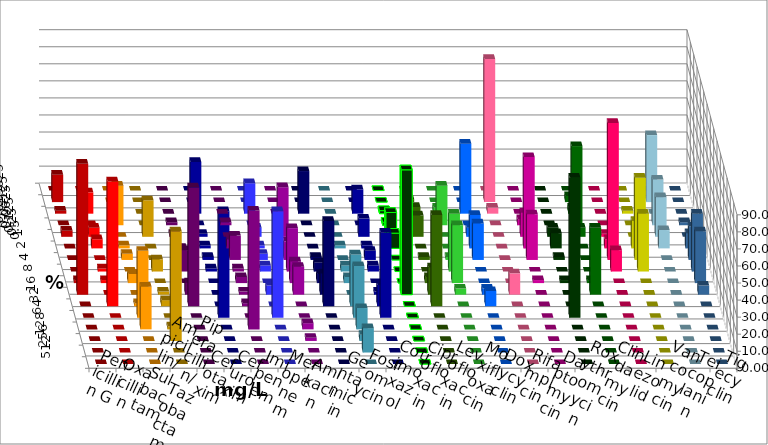
| Category | Penicillin G | Oxacillin | Ampicillin/ Sulbactam | Piperacillin/ Tazobactam | Cefotaxim | Cefuroxim | Imipenem | Meropenem | Amikacin | Gentamicin | Fosfomycin | Cotrimoxazol | Ciprofloxacin | Levofloxacin | Moxifloxacin | Doxycyclin | Rifampicin | Daptomycin | Roxythromycin | Clindamycin | Linezolid | Vancomycin | Teicoplanin | Tigecyclin |
|---|---|---|---|---|---|---|---|---|---|---|---|---|---|---|---|---|---|---|---|---|---|---|---|---|
| 0.015625 | 0 | 0 | 0 | 0 | 0 | 0 | 0 | 0 | 0 | 0 | 0 | 0 | 0 | 0 | 0 | 0 | 0 | 0 | 0 | 0 | 0 | 0 | 0 | 0 |
| 0.03125 | 16.071 | 0 | 0 | 0 | 0 | 0 | 0 | 0 | 0 | 0 | 0 | 0 | 0 | 1.786 | 0 | 0 | 83.929 | 0 | 0 | 3.571 | 0 | 0 | 0 | 39.286 |
| 0.0625 | 1.786 | 12.5 | 0 | 0 | 0 | 0 | 30.357 | 17.857 | 0 | 25 | 0 | 14.286 | 1.786 | 0 | 3.571 | 41.071 | 3.571 | 0 | 0 | 3.571 | 0 | 1.786 | 0 | 0 |
| 0.125 | 0 | 0 | 23.214 | 0 | 1.786 | 1.786 | 0 | 0 | 0 | 0 | 0 | 0 | 1.786 | 10.714 | 23.214 | 0 | 0 | 3.571 | 0 | 46.429 | 0 | 0 | 1.786 | 26.786 |
| 0.25 | 3.571 | 5.357 | 0 | 21.429 | 1.786 | 0 | 1.786 | 5.357 | 29.091 | 0 | 0 | 10.714 | 14.286 | 12.5 | 0 | 5.357 | 0 | 14.286 | 5.357 | 5.357 | 1.786 | 0 | 0 | 23.214 |
| 0.5 | 0 | 5.357 | 1.786 | 0 | 0 | 5.357 | 1.786 | 1.786 | 0 | 0 | 1.786 | 1.786 | 8.929 | 0 | 0 | 19.643 | 0 | 53.571 | 8.929 | 0 | 5.357 | 16.071 | 8.929 | 10.714 |
| 1.0 | 0 | 0 | 3.571 | 0 | 7.143 | 14.286 | 1.786 | 3.571 | 10.909 | 1.786 | 0 | 5.357 | 0 | 1.786 | 1.786 | 21.429 | 0 | 26.786 | 1.786 | 0 | 80.357 | 48.214 | 19.643 | 0 |
| 2.0 | 0 | 1.786 | 0 | 7.143 | 12.5 | 1.786 | 1.786 | 3.571 | 25.455 | 5.357 | 3.571 | 3.571 | 0 | 0 | 33.929 | 0 | 0 | 0 | 0 | 0 | 12.5 | 33.929 | 33.929 | 0 |
| 4.0 | 1.786 | 1.786 | 5.357 | 0 | 0 | 3.571 | 0 | 0 | 12.727 | 5.357 | 3.571 | 0 | 0 | 3.571 | 33.929 | 0 | 0 | 1.786 | 1.786 | 1.786 | 0 | 0 | 30.357 | 0 |
| 8.0 | 76.786 | 0 | 0 | 1.786 | 7.143 | 1.786 | 0 | 5.357 | 16.364 | 12.5 | 0 | 1.786 | 73.214 | 16.071 | 3.571 | 3.571 | 12.5 | 0 | 0 | 39.286 | 0 | 0 | 5.357 | 0 |
| 16.0 | 0 | 73.214 | 1.786 | 3.571 | 69.643 | 1.786 | 0 | 0 | 0 | 50 | 30.357 | 12.5 | 0 | 53.571 | 0 | 8.929 | 0 | 0 | 0 | 0 | 0 | 0 | 0 | 0 |
| 32.0 | 0 | 0 | 39.286 | 0 | 0 | 0 | 62.5 | 62.5 | 0 | 0 | 30.357 | 50 | 0 | 0 | 0 | 0 | 0 | 0 | 82.143 | 0 | 0 | 0 | 0 | 0 |
| 64.0 | 0 | 0 | 25 | 1.786 | 0 | 69.643 | 0 | 0 | 3.636 | 0 | 12.5 | 0 | 0 | 0 | 0 | 0 | 0 | 0 | 0 | 0 | 0 | 0 | 0 | 0 |
| 128.0 | 0 | 0 | 0 | 64.286 | 0 | 0 | 0 | 0 | 1.818 | 0 | 3.571 | 0 | 0 | 0 | 0 | 0 | 0 | 0 | 0 | 0 | 0 | 0 | 0 | 0 |
| 256.0 | 0 | 0 | 0 | 0 | 0 | 0 | 0 | 0 | 0 | 0 | 14.286 | 0 | 0 | 0 | 0 | 0 | 0 | 0 | 0 | 0 | 0 | 0 | 0 | 0 |
| 512.0 | 0 | 0 | 0 | 0 | 0 | 0 | 0 | 0 | 0 | 0 | 0 | 0 | 0 | 0 | 0 | 0 | 0 | 0 | 0 | 0 | 0 | 0 | 0 | 0 |